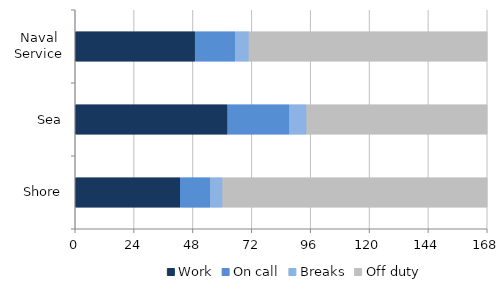
| Category | Work | On call | Breaks | Off duty |
|---|---|---|---|---|
| Naval Service | 48.924 | 16.326 | 5.646 | 97.098 |
| Sea | 62.165 | 25.24 | 7.05 | 73.531 |
| Shore | 42.899 | 12.27 | 5.007 | 107.821 |